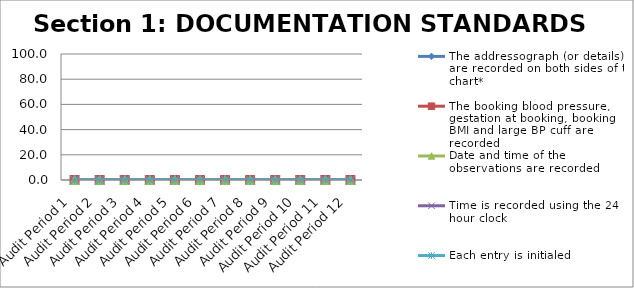
| Category | The addressograph (or details) are recorded on both sides of the chart* | The booking blood pressure, gestation at booking, booking BMI and large BP cuff are recorded | Date and time of the observations are recorded  | Time is recorded using the 24 hour clock | Each entry is initialed |
|---|---|---|---|---|---|
| Audit Period 1 | 0 | 0 | 0 | 0 | 0 |
| Audit Period 2 | 0 | 0 | 0 | 0 | 0 |
| Audit Period 3 | 0 | 0 | 0 | 0 | 0 |
| Audit Period 4 | 0 | 0 | 0 | 0 | 0 |
| Audit Period 5 | 0 | 0 | 0 | 0 | 0 |
| Audit Period 6 | 0 | 0 | 0 | 0 | 0 |
| Audit Period 7 | 0 | 0 | 0 | 0 | 0 |
| Audit Period 8 | 0 | 0 | 0 | 0 | 0 |
| Audit Period 9 | 0 | 0 | 0 | 0 | 0 |
| Audit Period 10 | 0 | 0 | 0 | 0 | 0 |
| Audit Period 11 | 0 | 0 | 0 | 0 | 0 |
| Audit Period 12 | 0 | 0 | 0 | 0 | 0 |